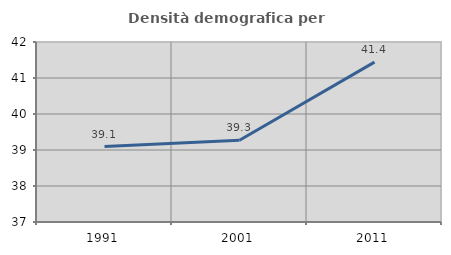
| Category | Densità demografica |
|---|---|
| 1991.0 | 39.096 |
| 2001.0 | 39.269 |
| 2011.0 | 41.441 |